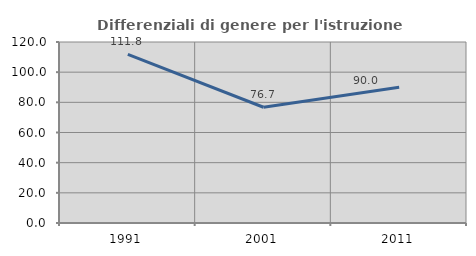
| Category | Differenziali di genere per l'istruzione superiore |
|---|---|
| 1991.0 | 111.783 |
| 2001.0 | 76.734 |
| 2011.0 | 89.984 |